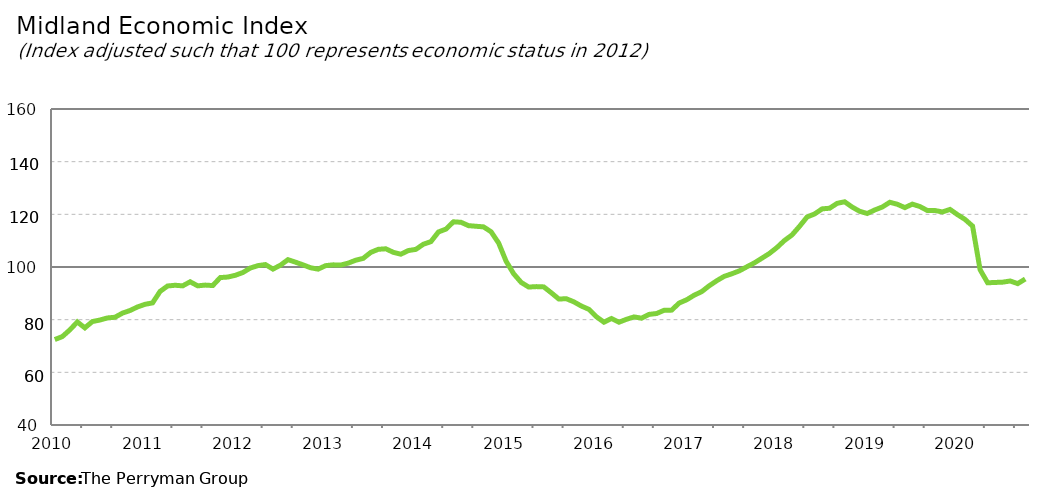
| Category | Midland Composite |
|---|---|
| 2010-01-31 | 72.451 |
| 2010-02-28 | 73.563 |
| 2010-03-31 | 76.106 |
| 2010-04-30 | 79.13 |
| 2010-05-31 | 76.889 |
| 2010-06-30 | 79.291 |
| 2010-07-31 | 79.863 |
| 2010-08-31 | 80.658 |
| 2010-09-30 | 80.912 |
| 2010-10-31 | 82.486 |
| 2010-11-30 | 83.471 |
| 2010-12-31 | 84.831 |
| 2011-01-31 | 85.829 |
| 2011-02-28 | 86.371 |
| 2011-03-31 | 90.737 |
| 2011-04-30 | 92.793 |
| 2011-05-31 | 93.064 |
| 2011-06-30 | 92.84 |
| 2011-07-31 | 94.386 |
| 2011-08-31 | 92.845 |
| 2011-09-30 | 93.126 |
| 2011-10-31 | 92.952 |
| 2011-11-30 | 95.988 |
| 2011-12-31 | 96.183 |
| 2012-01-31 | 96.849 |
| 2012-02-29 | 97.905 |
| 2012-03-31 | 99.618 |
| 2012-04-30 | 100.512 |
| 2012-05-31 | 100.926 |
| 2012-06-30 | 99.206 |
| 2012-07-31 | 100.683 |
| 2012-08-31 | 102.787 |
| 2012-09-30 | 101.829 |
| 2012-10-31 | 100.819 |
| 2012-11-30 | 99.719 |
| 2012-12-31 | 99.184 |
| 2013-01-31 | 100.514 |
| 2013-02-28 | 100.819 |
| 2013-03-31 | 100.725 |
| 2013-04-30 | 101.465 |
| 2013-05-31 | 102.568 |
| 2013-06-30 | 103.275 |
| 2013-07-31 | 105.539 |
| 2013-08-31 | 106.712 |
| 2013-09-30 | 106.916 |
| 2013-10-31 | 105.578 |
| 2013-11-30 | 104.858 |
| 2013-12-31 | 106.242 |
| 2014-01-31 | 106.696 |
| 2014-02-28 | 108.657 |
| 2014-03-31 | 109.63 |
| 2014-04-30 | 113.299 |
| 2014-05-31 | 114.4 |
| 2014-06-30 | 117.162 |
| 2014-07-31 | 116.979 |
| 2014-08-31 | 115.701 |
| 2014-09-30 | 115.47 |
| 2014-10-31 | 115.239 |
| 2014-11-30 | 113.363 |
| 2014-12-31 | 109.125 |
| 2015-01-31 | 102.17 |
| 2015-02-28 | 97.435 |
| 2015-03-31 | 94.14 |
| 2015-04-30 | 92.383 |
| 2015-05-31 | 92.554 |
| 2015-06-30 | 92.445 |
| 2015-07-31 | 90.205 |
| 2015-08-31 | 87.849 |
| 2015-09-30 | 87.945 |
| 2015-10-31 | 86.775 |
| 2015-11-30 | 85.169 |
| 2015-12-31 | 83.92 |
| 2016-01-31 | 81.102 |
| 2016-02-29 | 79.046 |
| 2016-03-31 | 80.441 |
| 2016-04-30 | 79.033 |
| 2016-05-31 | 80.141 |
| 2016-06-30 | 81.043 |
| 2016-07-31 | 80.569 |
| 2016-08-31 | 82.011 |
| 2016-09-30 | 82.332 |
| 2016-10-31 | 83.561 |
| 2016-11-30 | 83.624 |
| 2016-12-31 | 86.314 |
| 2017-01-31 | 87.559 |
| 2017-02-28 | 89.298 |
| 2017-03-31 | 90.653 |
| 2017-04-30 | 92.892 |
| 2017-05-31 | 94.798 |
| 2017-06-30 | 96.472 |
| 2017-07-31 | 97.429 |
| 2017-08-31 | 98.536 |
| 2017-09-30 | 100.075 |
| 2017-10-31 | 101.567 |
| 2017-11-30 | 103.349 |
| 2017-12-31 | 105.148 |
| 2018-01-31 | 107.417 |
| 2018-02-28 | 110.073 |
| 2018-03-31 | 112.179 |
| 2018-04-30 | 115.444 |
| 2018-05-31 | 118.99 |
| 2018-06-30 | 120.146 |
| 2018-07-31 | 122.072 |
| 2018-08-31 | 122.324 |
| 2018-09-30 | 124.178 |
| 2018-10-31 | 124.765 |
| 2018-11-30 | 122.747 |
| 2018-12-31 | 121.148 |
| 2019-01-31 | 120.319 |
| 2019-02-28 | 121.661 |
| 2019-03-31 | 122.78 |
| 2019-04-30 | 124.578 |
| 2019-05-31 | 123.821 |
| 2019-06-30 | 122.553 |
| 2019-07-31 | 123.877 |
| 2019-08-31 | 122.951 |
| 2019-09-30 | 121.441 |
| 2019-10-31 | 121.45 |
| 2019-11-30 | 120.901 |
| 2019-12-31 | 121.874 |
| 2020-01-31 | 119.874 |
| 2020-02-29 | 118.061 |
| 2020-03-31 | 115.523 |
| 2020-04-30 | 98.965 |
| 2020-05-31 | 94.004 |
| 2020-06-30 | 94.131 |
| 2020-07-31 | 94.243 |
| 2020-08-31 | 94.684 |
| 2020-09-30 | 93.691 |
| 2020-10-01 | 95.441 |